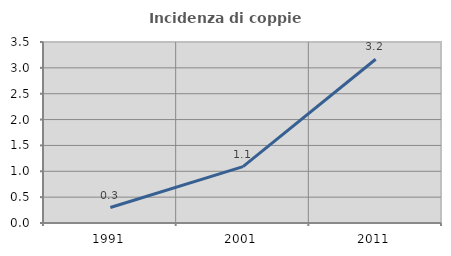
| Category | Incidenza di coppie miste |
|---|---|
| 1991.0 | 0.299 |
| 2001.0 | 1.089 |
| 2011.0 | 3.166 |